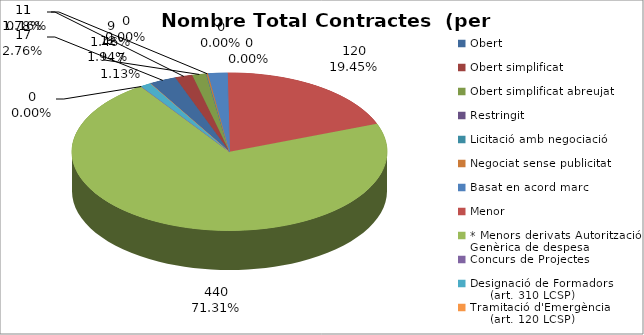
| Category | Nombre Total Contractes |
|---|---|
| Obert | 17 |
| Obert simplificat | 11 |
| Obert simplificat abreujat | 9 |
| Restringit | 0 |
| Licitació amb negociació | 0 |
| Negociat sense publicitat | 1 |
| Basat en acord marc | 12 |
| Menor | 120 |
| * Menors derivats Autorització Genèrica de despesa | 440 |
| Concurs de Projectes | 0 |
| Designació de Formadors
     (art. 310 LCSP) | 7 |
| Tramitació d'Emergència
     (art. 120 LCSP) | 0 |